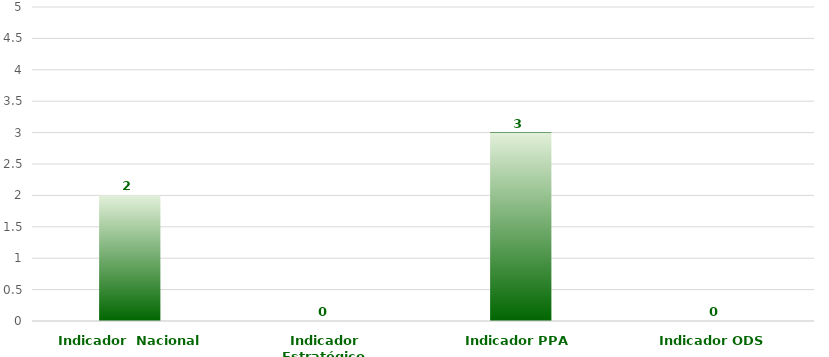
| Category | Series 0 |
|---|---|
| Indicador  Nacional | 2 |
| Indicador Estratégico | 0 |
| Indicador PPA | 3 |
| Indicador ODS | 0 |